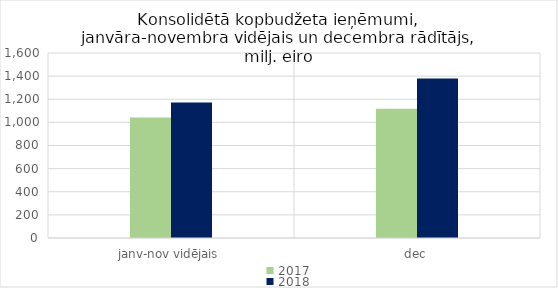
| Category | 2017 | 2018 |
|---|---|---|
| janv-nov vidējais | 1041217.7 | 1172203.675 |
| dec | 1118858.021 | 1379607.658 |